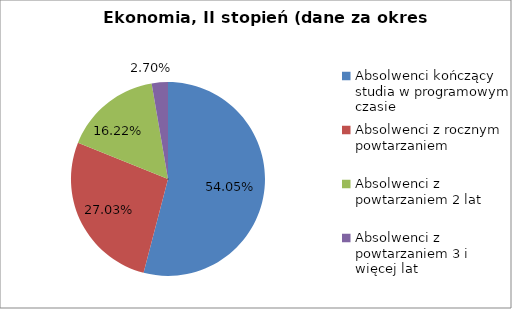
| Category | Series 0 |
|---|---|
| Absolwenci kończący studia w programowym czasie | 54.054 |
| Absolwenci z rocznym powtarzaniem | 27.027 |
| Absolwenci z powtarzaniem 2 lat | 16.216 |
| Absolwenci z powtarzaniem 3 i więcej lat | 2.703 |